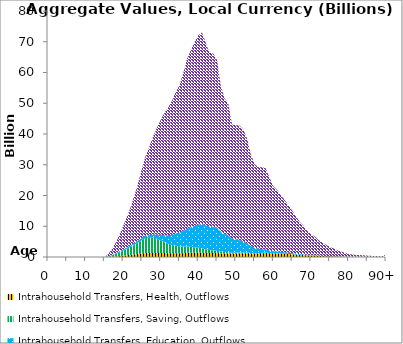
| Category | Intrahousehold Transfers, Health, Outflows | Intrahousehold Transfers, Saving, Outflows | Intrahousehold Transfers, Education, Outflows | Intrahousehold Transfers, Consumption other than health and education, Outflows |
|---|---|---|---|---|
| 0 | 0 | 0 | 0 | 0 |
|  | 0 | 0 | 0 | 0 |
| 2 | 0 | 0 | 0 | 0 |
| 3 | 0 | 0 | 0 | 0 |
| 4 | 0 | 0 | 0 | 0 |
| 5 | 0 | 0 | 0 | 0 |
| 6 | 0 | 0 | 0 | 0 |
| 7 | 0 | 0 | 0 | 0 |
| 8 | 0 | 0 | 0 | 0 |
| 9 | 0 | 0 | 0 | 0 |
| 10 | 0 | 0 | 0 | 0 |
| 11 | 0 | 0 | 0 | 0 |
| 12 | 0 | 0 | 0 | 0 |
| 13 | 0 | 0 | 0 | 0 |
| 14 | 0 | 0 | 0 | 0 |
| 15 | 0 | 0 | 0 | 0 |
| 16 | 26.419 | 161.24 | 41.471 | 654.564 |
| 17 | 83.396 | 421.078 | 122.318 | 1863.171 |
| 18 | 164.446 | 776.348 | 221.575 | 3493.487 |
| 19 | 271.567 | 1203.743 | 338.89 | 5448.568 |
| 20 | 412.138 | 1623.669 | 436.113 | 7549.993 |
| 21 | 559.205 | 2059.829 | 514.264 | 9865.033 |
| 22 | 696.575 | 2582.346 | 570.415 | 12391.546 |
| 23 | 852.565 | 3091.978 | 626.722 | 15332.342 |
| 24 | 1019.153 | 3659.712 | 672.968 | 18754.442 |
| 25 | 1157.052 | 4327.194 | 717.355 | 22521.797 |
| 26 | 1258.629 | 4861.513 | 775.327 | 26055.397 |
| 27 | 1312.966 | 4965.806 | 836.689 | 28844.293 |
| 28 | 1341.459 | 4965.792 | 1025.086 | 31910.628 |
| 29 | 1321.836 | 4617.884 | 1341.695 | 34678.854 |
| 30 | 1299.701 | 4130.916 | 1781.441 | 37389.73 |
| 31 | 1272.834 | 3529.465 | 2260.144 | 39788.951 |
| 32 | 1220.916 | 3084.021 | 2810.585 | 41557.25 |
| 33 | 1199.458 | 2684.242 | 3353.898 | 43490.24 |
| 34 | 1215.721 | 2488.961 | 3925.34 | 46098.223 |
| 35 | 1214.959 | 2241.98 | 4440.153 | 47933.602 |
| 36 | 1265.451 | 2165.803 | 5086.46 | 51164.97 |
| 37 | 1342.506 | 2063.526 | 5775.246 | 55200.407 |
| 38 | 1370.605 | 1937.128 | 6359.554 | 57593.235 |
| 39 | 1403.956 | 1756.451 | 6955.085 | 59774.318 |
| 40 | 1433.935 | 1597.583 | 7510.02 | 61511.595 |
| 41 | 1420.51 | 1402.26 | 7921.556 | 62285.868 |
| 42 | 1335.312 | 1161.786 | 7833.779 | 59328.943 |
| 43 | 1270.725 | 979.924 | 7619.492 | 56541.406 |
| 44 | 1271.245 | 863.579 | 7703.552 | 56315.986 |
| 45 | 1257.063 | 751.157 | 7482.9 | 54582.436 |
| 46 | 1143.795 | 591.615 | 6467.411 | 47616.514 |
| 47 | 1112.1 | 496.888 | 5849.015 | 44154.833 |
| 48 | 1137.596 | 432.504 | 5526.71 | 42850.182 |
| 49 | 1042.413 | 339.149 | 4574.062 | 37132.158 |
| 50 | 1100.347 | 305.094 | 4330.186 | 37106.04 |
| 51 | 1172.571 | 276.57 | 4042.427 | 37289.917 |
| 52 | 1215.319 | 245.333 | 3639.101 | 36297.912 |
| 53 | 1217.478 | 212.151 | 3022.479 | 34059.326 |
| 54 | 1138.47 | 173.035 | 2296.296 | 29838.893 |
| 55 | 1095.372 | 140.502 | 1787.285 | 27169.79 |
| 56 | 1141.144 | 123.761 | 1472.59 | 26489.758 |
| 57 | 1224.696 | 116.067 | 1190.251 | 26670.288 |
| 58 | 1288.256 | 109.896 | 1005.428 | 26413.022 |
| 59 | 1226.103 | 85.555 | 789.197 | 23735.066 |
| 60 | 1163.329 | 68.899 | 628.383 | 21142.464 |
| 61 | 1161.589 | 61.287 | 561.32 | 20027.634 |
| 62 | 1113.826 | 51.37 | 520.197 | 18435.255 |
| 63 | 1055.033 | 38.944 | 457.088 | 17017.783 |
| 64 | 975.344 | 34.139 | 399.163 | 15475.905 |
| 65 | 881.888 | 32.31 | 338.66 | 13889.493 |
| 66 | 771.488 | 29.569 | 272.703 | 12161.488 |
| 67 | 668.128 | 28.617 | 216.323 | 10570.475 |
| 68 | 600.152 | 29.542 | 193.149 | 9412.255 |
| 69 | 507.998 | 28.566 | 159.023 | 7834.059 |
| 70 | 450.478 | 26.565 | 141.88 | 6875.159 |
| 71 | 406.65 | 25.014 | 131.099 | 6140.422 |
| 72 | 346.518 | 20.687 | 109.788 | 5083.211 |
| 73 | 302.245 | 17.439 | 93.393 | 4299.368 |
| 74 | 262.002 | 0 | 80.859 | 3629.717 |
| 75 | 228.21 | 0 | 64.689 | 3026.269 |
| 76 | 202.964 | 0 | 51.184 | 2558.447 |
| 77 | 168.275 | 0 | 36.823 | 2030.318 |
| 78 | 139.943 | 0 | 25.837 | 1608.403 |
| 79 | 118.115 | 0 | 0 | 1301.818 |
| 80 | 88.427 | 0 | 0 | 939.013 |
| 81 | 71.543 | 0 | 0 | 734.047 |
| 82 | 64.29 | 0 | 0 | 629.735 |
| 83 | 59.036 | 0 | 0 | 569.115 |
| 84 | 46.217 | 0 | 0 | 497.85 |
| 85 | 35.188 | 0 | 0 | 404.879 |
| 86 | 27.312 | 0 | 0 | 340.084 |
| 87 | 21.767 | 0 | 0 | 301.624 |
| 88 | 18.246 | 0 | 0 | 273.762 |
| 89 | 15.429 | 0 | 0 | 236.265 |
| 90+ | 46.922 | 0 | 0 | 734.529 |